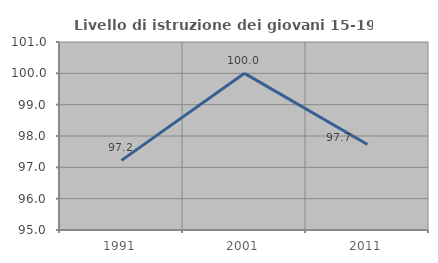
| Category | Livello di istruzione dei giovani 15-19 anni |
|---|---|
| 1991.0 | 97.222 |
| 2001.0 | 100 |
| 2011.0 | 97.727 |